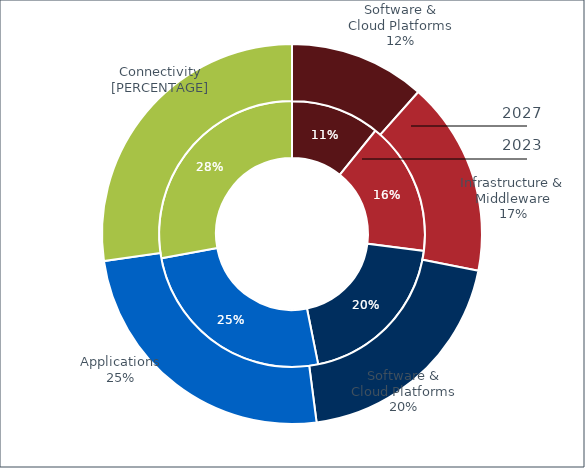
| Category | Series 0 | Series 1 |
|---|---|---|
| 0 | 84 | 98 |
| 1 | 126 | 140 |
| 2 | 154 | 168 |
| 3 | 196 | 210 |
| 4 | 217 | 231 |